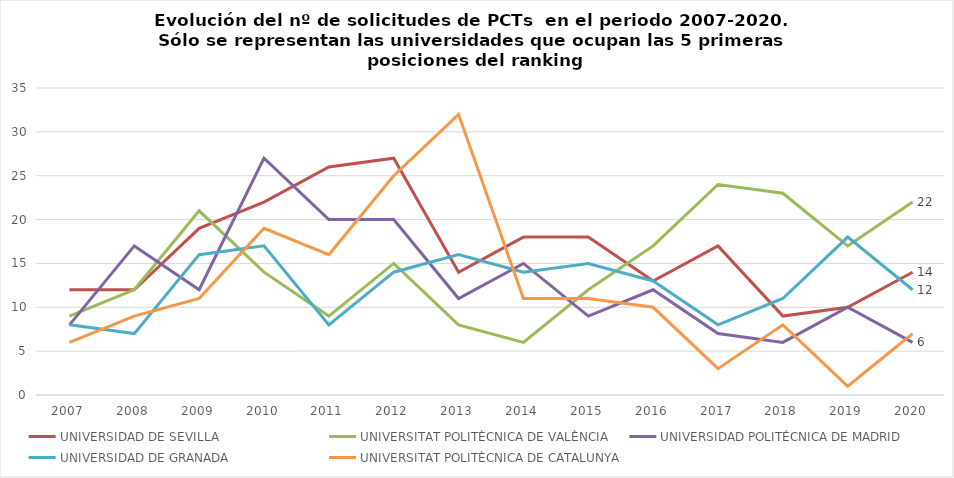
| Category | UNIVERSIDAD DE SEVILLA | UNIVERSITAT POLITÈCNICA DE VALÈNCIA | UNIVERSIDAD POLITÉCNICA DE MADRID | UNIVERSIDAD DE GRANADA | UNIVERSITAT POLITÈCNICA DE CATALUNYA |
|---|---|---|---|---|---|
| 2007 | 12 | 9 | 8 | 8 | 6 |
| 2008 | 12 | 12 | 17 | 7 | 9 |
| 2009 | 19 | 21 | 12 | 16 | 11 |
| 2010 | 22 | 14 | 27 | 17 | 19 |
| 2011 | 26 | 9 | 20 | 8 | 16 |
| 2012 | 27 | 15 | 20 | 14 | 25 |
| 2013 | 14 | 8 | 11 | 16 | 32 |
| 2014 | 18 | 6 | 15 | 14 | 11 |
| 2015 | 18 | 12 | 9 | 15 | 11 |
| 2016 | 13 | 17 | 12 | 13 | 10 |
| 2017 | 17 | 24 | 7 | 8 | 3 |
| 2018 | 9 | 23 | 6 | 11 | 8 |
| 2019 | 10 | 17 | 10 | 18 | 1 |
| 2020 | 14 | 22 | 6 | 12 | 7 |